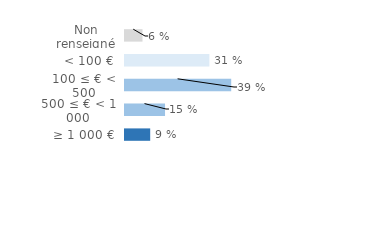
| Category | Series 0 |
|---|---|
| Non renseigné | 0.064 |
| < 100 € | 0.309 |
| 100 ≤ € < 500 | 0.389 |
| 500 ≤ € < 1 000 | 0.146 |
| ≥ 1 000 € | 0.092 |